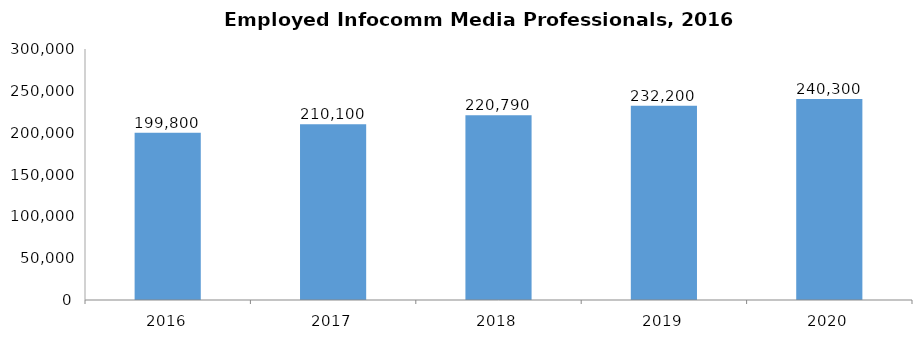
| Category | Employed Infocomm Media Professionals |
|---|---|
| 2016.0 | 199800 |
| 2017.0 | 210100 |
| 2018.0 | 220790 |
| 2019.0 | 232200 |
| 2020.0 | 240300 |